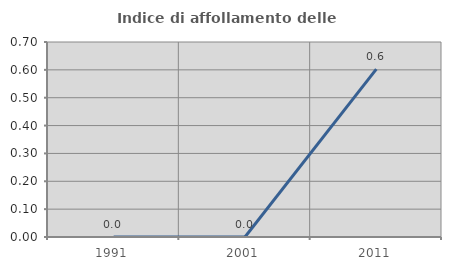
| Category | Indice di affollamento delle abitazioni  |
|---|---|
| 1991.0 | 0 |
| 2001.0 | 0 |
| 2011.0 | 0.602 |